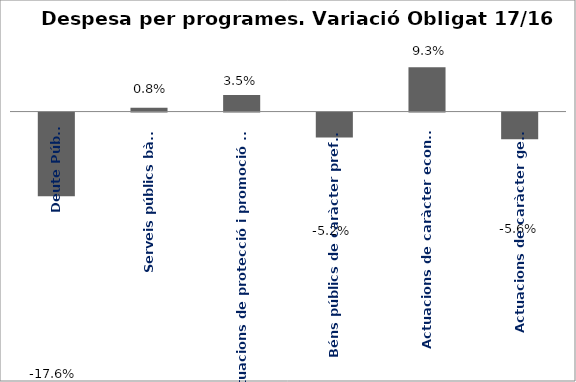
| Category | Series 0 |
|---|---|
| Deute Públic | -0.176 |
| Serveis públics bàsics | 0.008 |
| Actuacions de protecció i promoció social | 0.035 |
| Béns públics de caràcter preferent | -0.052 |
| Actuacions de caràcter econòmic | 0.093 |
| Actuacions de caràcter general | -0.056 |